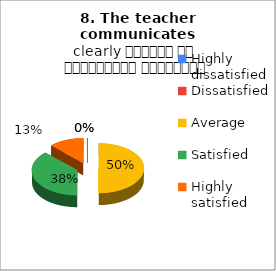
| Category | 8. The teacher communicates clearly शिक्षक का सम्प्रेषण सुस्पष्ट है |
|---|---|
| Highly dissatisfied | 0 |
| Dissatisfied | 0 |
| Average | 4 |
| Satisfied | 3 |
| Highly satisfied | 1 |